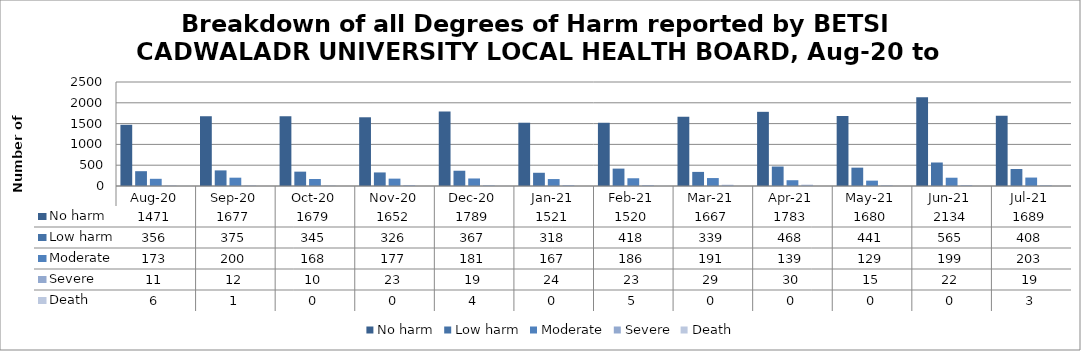
| Category | No harm | Low harm | Moderate | Severe | Death |
|---|---|---|---|---|---|
| Aug-20 | 1471 | 356 | 173 | 11 | 6 |
| Sep-20 | 1677 | 375 | 200 | 12 | 1 |
| Oct-20 | 1679 | 345 | 168 | 10 | 0 |
| Nov-20 | 1652 | 326 | 177 | 23 | 0 |
| Dec-20 | 1789 | 367 | 181 | 19 | 4 |
| Jan-21 | 1521 | 318 | 167 | 24 | 0 |
| Feb-21 | 1520 | 418 | 186 | 23 | 5 |
| Mar-21 | 1667 | 339 | 191 | 29 | 0 |
| Apr-21 | 1783 | 468 | 139 | 30 | 0 |
| May-21 | 1680 | 441 | 129 | 15 | 0 |
| Jun-21 | 2134 | 565 | 199 | 22 | 0 |
| Jul-21 | 1689 | 408 | 203 | 19 | 3 |